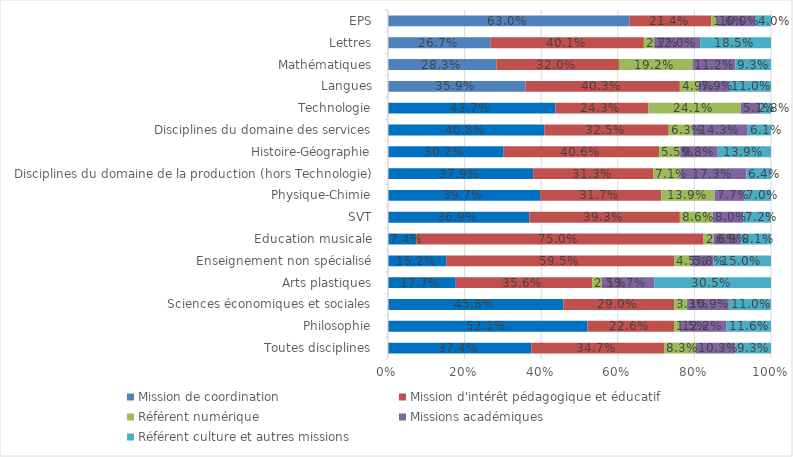
| Category | Mission de coordination | Mission d'intérêt pédagogique et éducatif | Référent numérique | Missions académiques | Référent culture et autres missions |
|---|---|---|---|---|---|
| Toutes disciplines | 0.374 | 0.347 | 0.083 | 0.103 | 0.093 |
| Philosophie | 0.521 | 0.226 | 0.015 | 0.122 | 0.116 |
| Sciences économiques et sociales | 0.458 | 0.29 | 0.033 | 0.109 | 0.11 |
| Arts plastiques | 0.177 | 0.356 | 0.025 | 0.137 | 0.305 |
| Enseignement non spécialisé | 0.152 | 0.595 | 0.045 | 0.058 | 0.15 |
| Education musicale | 0.074 | 0.75 | 0.026 | 0.069 | 0.081 |
| SVT | 0.369 | 0.393 | 0.086 | 0.08 | 0.072 |
| Physique-Chimie | 0.397 | 0.317 | 0.139 | 0.077 | 0.07 |
| Disciplines du domaine de la production (hors Technologie) | 0.379 | 0.313 | 0.071 | 0.173 | 0.064 |
| Histoire-Géographie | 0.302 | 0.406 | 0.055 | 0.098 | 0.139 |
| Disciplines du domaine des services | 0.408 | 0.325 | 0.063 | 0.143 | 0.061 |
| Technologie | 0.437 | 0.243 | 0.241 | 0.051 | 0.028 |
| Langues | 0.359 | 0.403 | 0.049 | 0.079 | 0.11 |
| Mathématiques | 0.283 | 0.32 | 0.192 | 0.112 | 0.093 |
| Lettres | 0.267 | 0.401 | 0.027 | 0.12 | 0.185 |
| EPS | 0.63 | 0.214 | 0.016 | 0.1 | 0.04 |